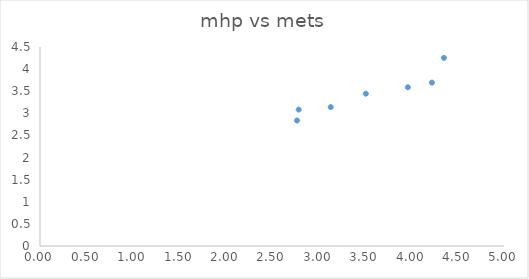
| Category | mhp vs mets |
|---|---|
| 2.787769784172662 | 3.085 |
| 2.7697841726618706 | 2.838 |
| 3.133093525179856 | 3.141 |
| 3.510791366906475 | 3.445 |
| 4.352517985611511 | 4.254 |
| 3.964028776978417 | 3.59 |
| 4.223021582733813 | 3.695 |